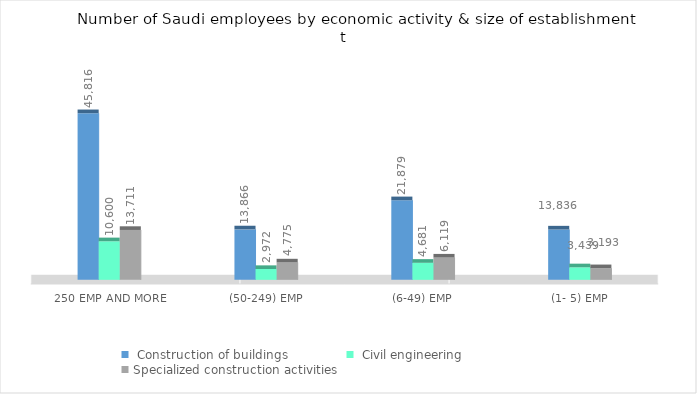
| Category |  Construction of buildings |  Civil engineering | Specialized construction activities |
|---|---|---|---|
|  (1- 5) emp  | 13836.425 | 3438.794 | 3192.813 |
|  (6-49) emp  | 21878.87 | 4681.091 | 6119 |
|  (50-249) emp  | 13865.896 | 2971.679 | 4775.213 |
|  250 emp and more  | 45816.031 | 10600.263 | 13710.939 |